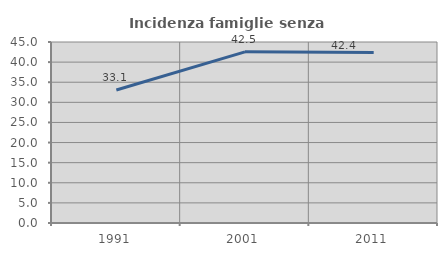
| Category | Incidenza famiglie senza nuclei |
|---|---|
| 1991.0 | 33.077 |
| 2001.0 | 42.545 |
| 2011.0 | 42.378 |